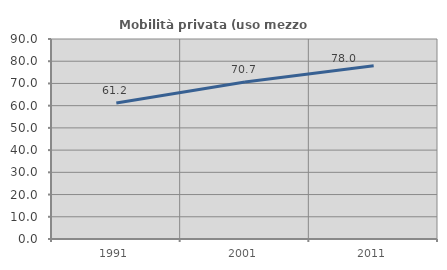
| Category | Mobilità privata (uso mezzo privato) |
|---|---|
| 1991.0 | 61.177 |
| 2001.0 | 70.681 |
| 2011.0 | 77.967 |